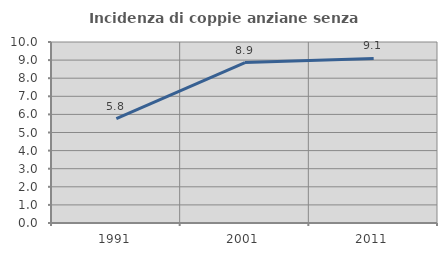
| Category | Incidenza di coppie anziane senza figli  |
|---|---|
| 1991.0 | 5.769 |
| 2001.0 | 8.861 |
| 2011.0 | 9.091 |